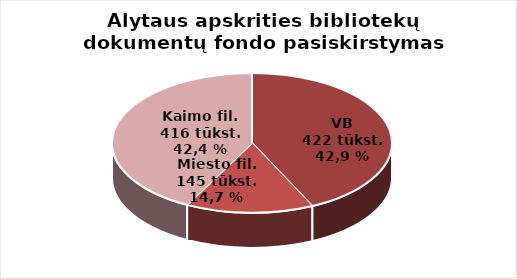
| Category | Series 0 |
|---|---|
| VB | 422255 |
| Miesto filialuose | 144921 |
| Kaimo filialuose | 416449 |